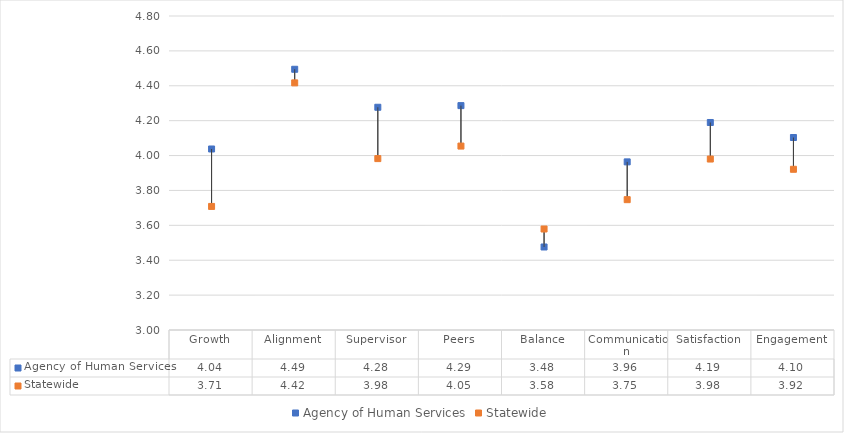
| Category | Agency of Human Services | Statewide |
|---|---|---|
| Growth | 4.038 | 3.708 |
| Alignment | 4.495 | 4.417 |
| Supervisor | 4.277 | 3.983 |
| Peers | 4.286 | 4.054 |
| Balance | 3.476 | 3.579 |
| Communication | 3.964 | 3.747 |
| Satisfaction | 4.19 | 3.98 |
| Engagement | 4.103 | 3.921 |